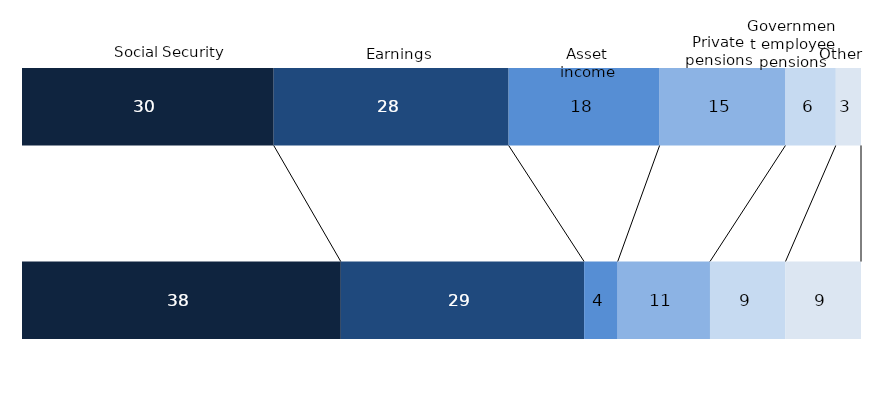
| Category | Social Security | Earnings | Other | Asset income | Government employee pensions | Private pensions |
|---|---|---|---|---|---|---|
|  | 30 | 28 | 18 | 15 | 6 | 3 |
|  | 38 | 29 | 4 | 11 | 9 | 9 |